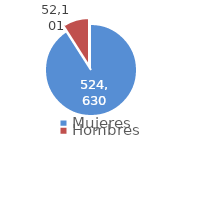
| Category | Series 0 |
|---|---|
| Mujeres | 524630 |
| Hombres | 52101 |